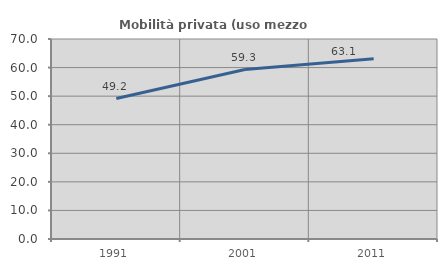
| Category | Mobilità privata (uso mezzo privato) |
|---|---|
| 1991.0 | 49.155 |
| 2001.0 | 59.306 |
| 2011.0 | 63.114 |